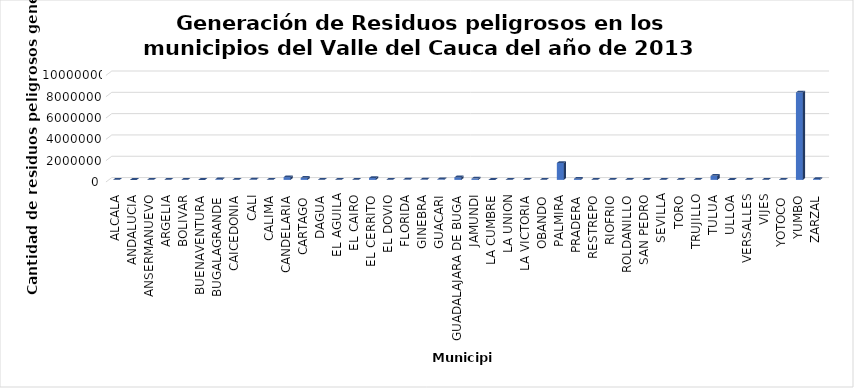
| Category | Series 0 |
|---|---|
| ALCALA | 2084 |
| ANDALUCIA | 231 |
| ANSERMANUEVO | 3517.95 |
| ARGELIA | 872.8 |
| BOLIVAR | 1692.89 |
| BUENAVENTURA | 270.2 |
| BUGALAGRANDE | 62093.05 |
| CAICEDONIA | 9935.7 |
| CALI | 41603.49 |
| CALIMA | 1068 |
| CANDELARIA | 256255.41 |
| CARTAGO | 189129.22 |
| DAGUA | 7120 |
| EL AGUILA | 1355.44 |
| EL CAIRO | 908.1 |
| EL CERRITO | 173720.18 |
| EL DOVIO | 1862.3 |
| FLORIDA | 28950.16 |
| GINEBRA | 30510.6 |
| GUACARI | 53577.1 |
| GUADALAJARA DE BUGA | 233781.07 |
| JAMUNDI | 118754.52 |
| LA CUMBRE | 345 |
| LA UNION | 12096.53 |
| LA VICTORIA | 2512 |
| OBANDO | 3765 |
| PALMIRA | 1589541.91 |
| PRADERA | 106847.06 |
| RESTREPO | 1005.4 |
| RIOFRIO | 3464.9 |
| ROLDANILLO | 12304.6 |
| SAN PEDRO | 12012.35 |
| SEVILLA | 14915.6 |
| TORO | 1640 |
| TRUJILLO | 3745.1 |
| TULUA | 376700.59 |
| ULLOA | 650.6 |
| VERSALLES | 1256.49 |
| VIJES | 1926 |
| YOTOCO | 12793 |
| YUMBO | 8202723.45 |
| ZARZAL | 77454.45 |